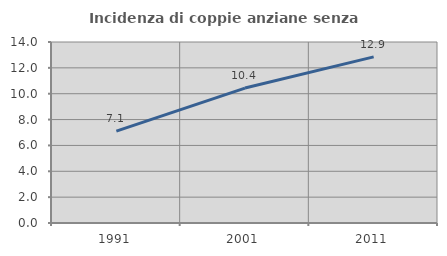
| Category | Incidenza di coppie anziane senza figli  |
|---|---|
| 1991.0 | 7.102 |
| 2001.0 | 10.437 |
| 2011.0 | 12.851 |